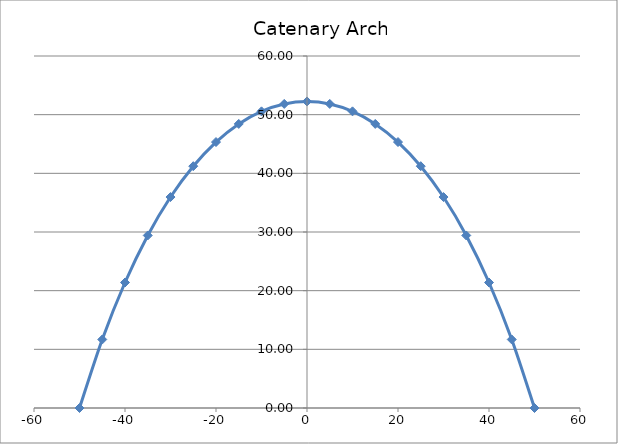
| Category | Series 0 |
|---|---|
| -50.0 | 0 |
| -45.0 | 11.678 |
| -40.0 | 21.392 |
| -35.0 | 29.41 |
| -30.0 | 35.958 |
| -25.0 | 41.217 |
| -20.0 | 45.333 |
| -15.0 | 48.422 |
| -10.0 | 50.568 |
| -5.0 | 51.833 |
| 0.0 | 52.25 |
| 5.0 | 51.833 |
| 10.0 | 50.568 |
| 15.0 | 48.422 |
| 20.0 | 45.333 |
| 25.0 | 41.217 |
| 30.0 | 35.958 |
| 35.0 | 29.41 |
| 40.0 | 21.392 |
| 45.0 | 11.678 |
| 50.0 | 0 |